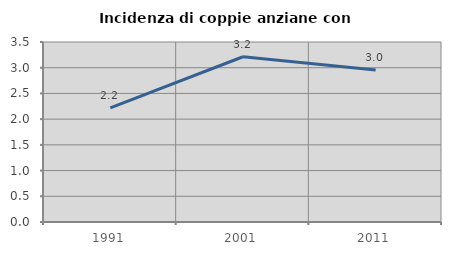
| Category | Incidenza di coppie anziane con figli |
|---|---|
| 1991.0 | 2.219 |
| 2001.0 | 3.213 |
| 2011.0 | 2.954 |